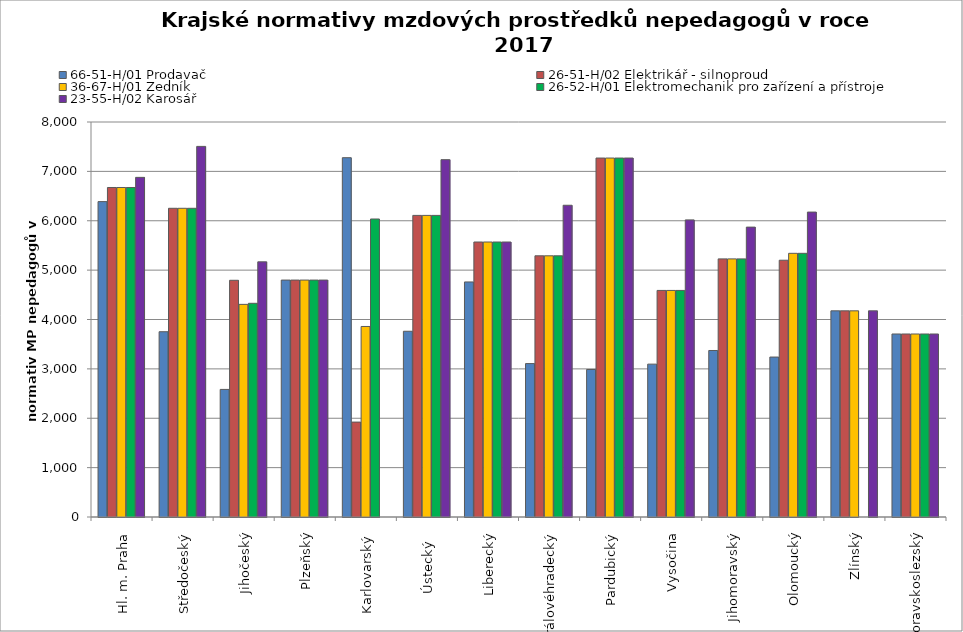
| Category | 66-51-H/01 Prodavač | 26-51-H/02 Elektrikář - silnoproud | 36-67-H/01 Zedník | 26-52-H/01 Elektromechanik pro zařízení a přístroje | 23-55-H/02 Karosář |
|---|---|---|---|---|---|
| Hl. m. Praha | 6387.429 | 6673.433 | 6673.433 | 6673.433 | 6878.769 |
| Středočeský | 3752.275 | 6252.308 | 6252.308 | 6252.308 | 7505.886 |
| Jihočeský | 2583.959 | 4794.168 | 4306.459 | 4328.101 | 5167.918 |
| Plzeňský | 4798.558 | 4798.558 | 4798.558 | 4798.558 | 4798.558 |
| Karlovarský  | 7277.051 | 1922.392 | 3858.764 | 6035.503 | 0 |
| Ústecký   | 3761.822 | 6108.424 | 6108.424 | 6108.424 | 7237.029 |
| Liberecký | 4760.525 | 5569.454 | 5569.454 | 5569.454 | 5569.454 |
| Královéhradecký | 3107.075 | 5290.132 | 5290.132 | 5290.132 | 6313.864 |
| Pardubický | 2987.671 | 7270 | 7270 | 7270 | 7270 |
| Vysočina | 3096.117 | 4588.781 | 4588.781 | 4588.781 | 6017.502 |
| Jihomoravský | 3372.338 | 5227.831 | 5227.831 | 5227.831 | 5870.989 |
| Olomoucký | 3239.472 | 5200.628 | 5340.468 | 5340.468 | 6175.746 |
| Zlínský | 4175.51 | 4175.51 | 4175.51 | 0 | 4175.51 |
| Moravskoslezský | 3706.47 | 3706.47 | 3706.47 | 3706.47 | 3706.47 |